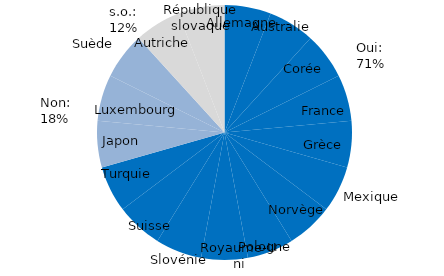
| Category | Series 0 |
|---|---|
| 0 | 1 |
| 1 | 1 |
| 2 | 1 |
| 3 | 1 |
| 4 | 1 |
| 5 | 1 |
| 6 | 1 |
| 7 | 1 |
| 8 | 1 |
| 9 | 1 |
| 10 | 1 |
| 11 | 1 |
| 12 | 1 |
| 13 | 1 |
| 14 | 1 |
| 15 | 1 |
| 16 | 1 |